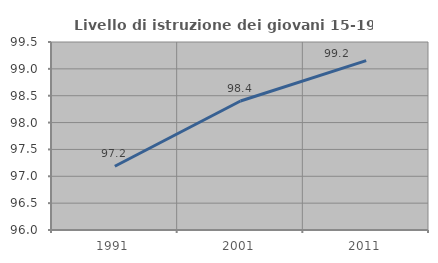
| Category | Livello di istruzione dei giovani 15-19 anni |
|---|---|
| 1991.0 | 97.187 |
| 2001.0 | 98.401 |
| 2011.0 | 99.153 |